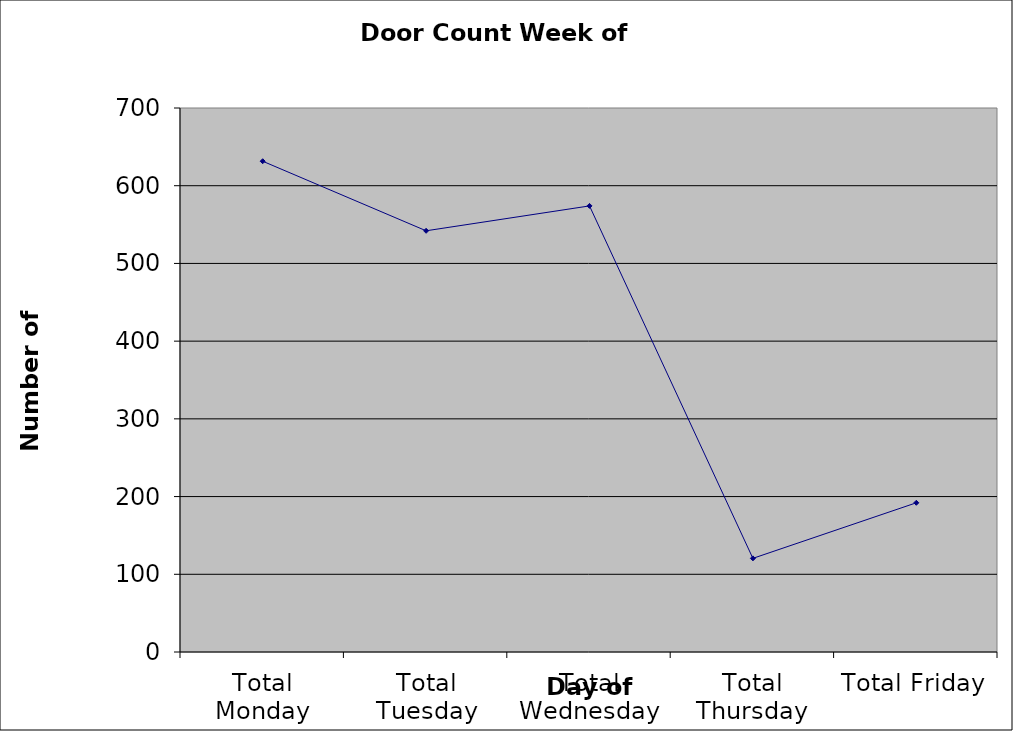
| Category | Series 0 |
|---|---|
| Total Monday | 631.5 |
| Total Tuesday | 542 |
| Total Wednesday | 574 |
| Total Thursday | 120.5 |
| Total Friday | 192 |